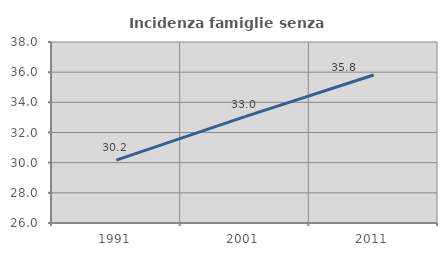
| Category | Incidenza famiglie senza nuclei |
|---|---|
| 1991.0 | 30.164 |
| 2001.0 | 33.048 |
| 2011.0 | 35.813 |